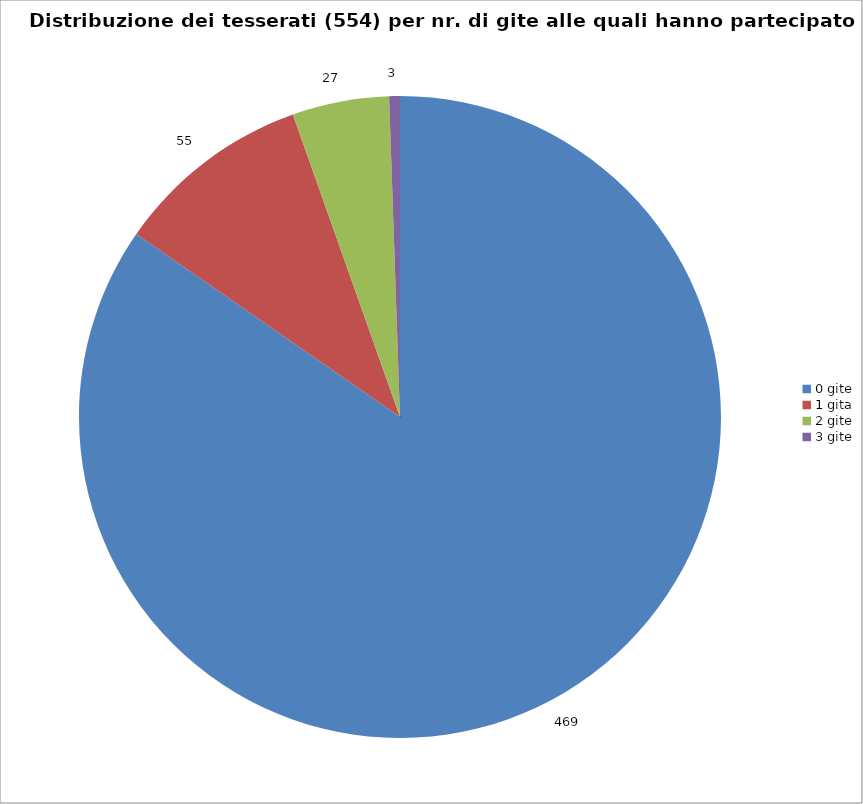
| Category | Nr. Tesserati |
|---|---|
| 0 gite | 469 |
| 1 gita | 55 |
| 2 gite | 27 |
| 3 gite | 3 |